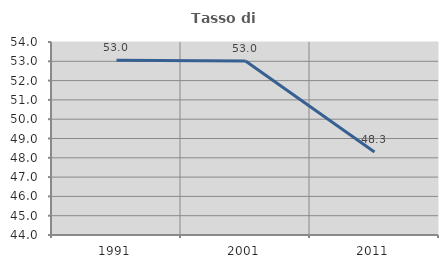
| Category | Tasso di occupazione   |
|---|---|
| 1991.0 | 53.048 |
| 2001.0 | 53.015 |
| 2011.0 | 48.296 |